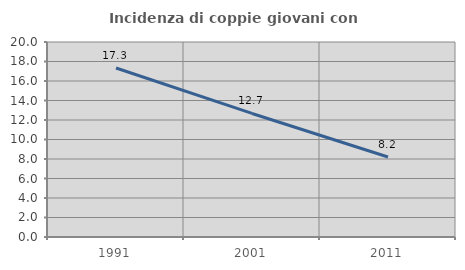
| Category | Incidenza di coppie giovani con figli |
|---|---|
| 1991.0 | 17.334 |
| 2001.0 | 12.672 |
| 2011.0 | 8.205 |